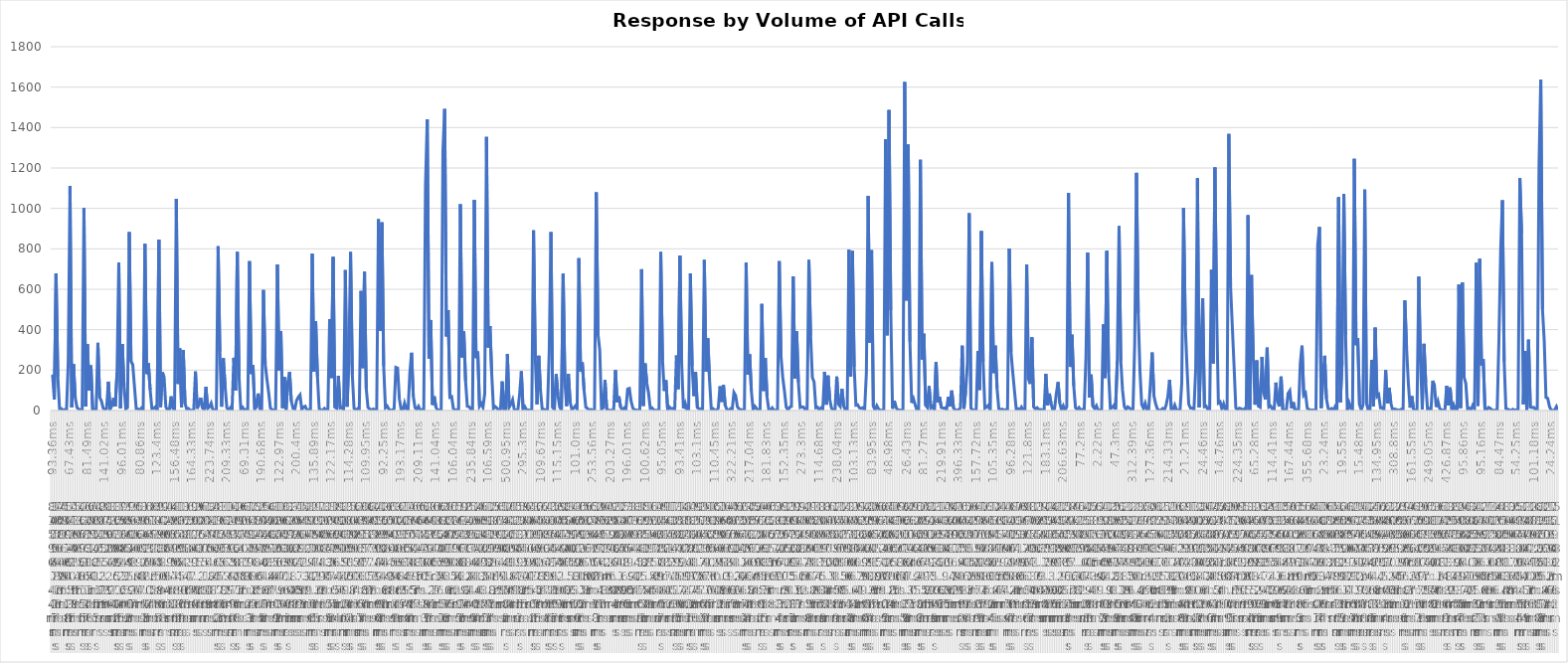
| Category | Number of Calls |
|---|---|
| 0 | 178 |
| 1 | 54 |
| 2 | 678 |
| 3 | 168 |
| 4 | 9 |
| 5 | 10 |
| 6 | 1 |
| 7 | 4 |
| 8 | 1 |
| 9 | 241 |
| 10 | 1112 |
| 11 | 16 |
| 12 | 229 |
| 13 | 65 |
| 14 | 15 |
| 15 | 7 |
| 16 | 2 |
| 17 | 2 |
| 18 | 1002 |
| 19 | 20 |
| 20 | 328 |
| 21 | 99 |
| 22 | 223 |
| 23 | 5 |
| 24 | 6 |
| 25 | 1 |
| 26 | 335 |
| 27 | 66 |
| 28 | 48 |
| 29 | 13 |
| 30 | 4 |
| 31 | 9 |
| 32 | 143 |
| 33 | 7 |
| 34 | 23 |
| 35 | 62 |
| 36 | 20 |
| 37 | 188 |
| 38 | 733 |
| 39 | 10 |
| 40 | 329 |
| 41 | 123 |
| 42 | 8 |
| 43 | 15 |
| 44 | 883 |
| 45 | 243 |
| 46 | 228 |
| 47 | 118 |
| 48 | 9 |
| 49 | 8 |
| 50 | 1 |
| 51 | 12 |
| 52 | 3 |
| 53 | 825 |
| 54 | 181 |
| 55 | 234 |
| 56 | 102 |
| 57 | 9 |
| 58 | 10 |
| 59 | 18 |
| 60 | 1 |
| 61 | 846 |
| 62 | 17 |
| 63 | 189 |
| 64 | 164 |
| 65 | 18 |
| 66 | 2 |
| 67 | 2 |
| 68 | 70 |
| 69 | 12 |
| 70 | 1 |
| 71 | 1047 |
| 72 | 132 |
| 73 | 307 |
| 74 | 16 |
| 75 | 299 |
| 76 | 36 |
| 77 | 6 |
| 78 | 10 |
| 79 | 1 |
| 80 | 1 |
| 81 | 1 |
| 82 | 193 |
| 83 | 9 |
| 84 | 36 |
| 85 | 63 |
| 86 | 13 |
| 87 | 5 |
| 88 | 117 |
| 89 | 10 |
| 90 | 18 |
| 91 | 36 |
| 92 | 3 |
| 93 | 2 |
| 94 | 4 |
| 95 | 813 |
| 96 | 292 |
| 97 | 19 |
| 98 | 258 |
| 99 | 121 |
| 100 | 14 |
| 101 | 2 |
| 102 | 14 |
| 103 | 2 |
| 104 | 261 |
| 105 | 99 |
| 106 | 784 |
| 107 | 167 |
| 108 | 7 |
| 109 | 16 |
| 110 | 1 |
| 111 | 5 |
| 112 | 1 |
| 113 | 739 |
| 114 | 181 |
| 115 | 225 |
| 116 | 6 |
| 117 | 19 |
| 118 | 84 |
| 119 | 8 |
| 120 | 1 |
| 121 | 596 |
| 122 | 231 |
| 123 | 156 |
| 124 | 89 |
| 125 | 12 |
| 126 | 4 |
| 127 | 1 |
| 128 | 6 |
| 129 | 723 |
| 130 | 197 |
| 131 | 393 |
| 132 | 12 |
| 133 | 166 |
| 134 | 3 |
| 135 | 141 |
| 136 | 191 |
| 137 | 46 |
| 138 | 11 |
| 139 | 5 |
| 140 | 49 |
| 141 | 66 |
| 142 | 77 |
| 143 | 4 |
| 144 | 17 |
| 145 | 21 |
| 146 | 1 |
| 147 | 4 |
| 148 | 2 |
| 149 | 776 |
| 150 | 192 |
| 151 | 442 |
| 152 | 170 |
| 153 | 8 |
| 154 | 3 |
| 155 | 1 |
| 156 | 10 |
| 157 | 2 |
| 158 | 6 |
| 159 | 452 |
| 160 | 161 |
| 161 | 760 |
| 162 | 16 |
| 163 | 11 |
| 164 | 172 |
| 165 | 13 |
| 166 | 16 |
| 167 | 2 |
| 168 | 695 |
| 169 | 19 |
| 170 | 249 |
| 171 | 784 |
| 172 | 179 |
| 173 | 11 |
| 174 | 2 |
| 175 | 9 |
| 176 | 1 |
| 177 | 591 |
| 178 | 210 |
| 179 | 686 |
| 180 | 109 |
| 181 | 16 |
| 182 | 7 |
| 183 | 1 |
| 184 | 7 |
| 185 | 3 |
| 186 | 3 |
| 187 | 947 |
| 188 | 394 |
| 189 | 931 |
| 190 | 222 |
| 191 | 14 |
| 192 | 22 |
| 193 | 6 |
| 194 | 1 |
| 195 | 2 |
| 196 | 10 |
| 197 | 213 |
| 198 | 210 |
| 199 | 58 |
| 200 | 5 |
| 201 | 1 |
| 202 | 37 |
| 203 | 8 |
| 204 | 1 |
| 205 | 184 |
| 206 | 286 |
| 207 | 71 |
| 208 | 14 |
| 209 | 6 |
| 210 | 21 |
| 211 | 1 |
| 212 | 4 |
| 213 | 1 |
| 214 | 1110 |
| 215 | 1441 |
| 216 | 257 |
| 217 | 448 |
| 218 | 28 |
| 219 | 70 |
| 220 | 16 |
| 221 | 1 |
| 222 | 2 |
| 223 | 1 |
| 224 | 1282 |
| 225 | 1492 |
| 226 | 367 |
| 227 | 497 |
| 228 | 66 |
| 229 | 69 |
| 230 | 10 |
| 231 | 1 |
| 232 | 3 |
| 233 | 1 |
| 234 | 1020 |
| 235 | 263 |
| 236 | 391 |
| 237 | 147 |
| 238 | 21 |
| 239 | 19 |
| 240 | 7 |
| 241 | 2 |
| 242 | 1042 |
| 243 | 259 |
| 244 | 292 |
| 245 | 21 |
| 246 | 35 |
| 247 | 16 |
| 248 | 84 |
| 249 | 1354 |
| 250 | 312 |
| 251 | 418 |
| 252 | 183 |
| 253 | 10 |
| 254 | 19 |
| 255 | 12 |
| 256 | 1 |
| 257 | 1 |
| 258 | 144 |
| 259 | 6 |
| 260 | 4 |
| 261 | 279 |
| 262 | 16 |
| 263 | 31 |
| 264 | 53 |
| 265 | 1 |
| 266 | 2 |
| 267 | 1 |
| 268 | 80 |
| 269 | 194 |
| 270 | 6 |
| 271 | 19 |
| 272 | 3 |
| 273 | 2 |
| 274 | 1 |
| 275 | 2 |
| 276 | 891 |
| 277 | 258 |
| 278 | 30 |
| 279 | 271 |
| 280 | 99 |
| 281 | 4 |
| 282 | 6 |
| 283 | 1 |
| 284 | 4 |
| 285 | 291 |
| 286 | 883 |
| 287 | 14 |
| 288 | 6 |
| 289 | 180 |
| 290 | 76 |
| 291 | 17 |
| 292 | 1 |
| 293 | 676 |
| 294 | 141 |
| 295 | 22 |
| 296 | 181 |
| 297 | 43 |
| 298 | 5 |
| 299 | 11 |
| 300 | 22 |
| 301 | 7 |
| 302 | 754 |
| 303 | 193 |
| 304 | 238 |
| 305 | 100 |
| 306 | 16 |
| 307 | 10 |
| 308 | 1 |
| 309 | 5 |
| 310 | 1 |
| 311 | 1 |
| 312 | 1079 |
| 313 | 377 |
| 314 | 300 |
| 315 | 6 |
| 316 | 14 |
| 317 | 151 |
| 318 | 6 |
| 319 | 1 |
| 320 | 1 |
| 321 | 1 |
| 322 | 2 |
| 323 | 200 |
| 324 | 41 |
| 325 | 70 |
| 326 | 16 |
| 327 | 3 |
| 328 | 12 |
| 329 | 2 |
| 330 | 106 |
| 331 | 109 |
| 332 | 46 |
| 333 | 12 |
| 334 | 3 |
| 335 | 2 |
| 336 | 1 |
| 337 | 3 |
| 338 | 699 |
| 339 | 23 |
| 340 | 233 |
| 341 | 137 |
| 342 | 87 |
| 343 | 10 |
| 344 | 13 |
| 345 | 2 |
| 346 | 1 |
| 347 | 1 |
| 348 | 2 |
| 349 | 784 |
| 350 | 255 |
| 351 | 97 |
| 352 | 150 |
| 353 | 1 |
| 354 | 17 |
| 355 | 9 |
| 356 | 11 |
| 357 | 2 |
| 358 | 272 |
| 359 | 106 |
| 360 | 766 |
| 361 | 237 |
| 362 | 10 |
| 363 | 36 |
| 364 | 6 |
| 365 | 7 |
| 366 | 679 |
| 367 | 221 |
| 368 | 72 |
| 369 | 191 |
| 370 | 15 |
| 371 | 8 |
| 372 | 8 |
| 373 | 3 |
| 374 | 745 |
| 375 | 192 |
| 376 | 357 |
| 377 | 153 |
| 378 | 4 |
| 379 | 9 |
| 380 | 2 |
| 381 | 1 |
| 382 | 11 |
| 383 | 120 |
| 384 | 43 |
| 385 | 126 |
| 386 | 25 |
| 387 | 4 |
| 388 | 1 |
| 389 | 9 |
| 390 | 4 |
| 391 | 89 |
| 392 | 74 |
| 393 | 18 |
| 394 | 8 |
| 395 | 5 |
| 396 | 1 |
| 397 | 5 |
| 398 | 732 |
| 399 | 177 |
| 400 | 278 |
| 401 | 98 |
| 402 | 4 |
| 403 | 21 |
| 404 | 10 |
| 405 | 1 |
| 406 | 1 |
| 407 | 527 |
| 408 | 97 |
| 409 | 260 |
| 410 | 68 |
| 411 | 4 |
| 412 | 1 |
| 413 | 13 |
| 414 | 1 |
| 415 | 1 |
| 416 | 1 |
| 417 | 739 |
| 418 | 270 |
| 419 | 166 |
| 420 | 95 |
| 421 | 17 |
| 422 | 2 |
| 423 | 16 |
| 424 | 20 |
| 425 | 664 |
| 426 | 159 |
| 427 | 391 |
| 428 | 139 |
| 429 | 15 |
| 430 | 18 |
| 431 | 17 |
| 432 | 2 |
| 433 | 1 |
| 434 | 745 |
| 435 | 371 |
| 436 | 164 |
| 437 | 141 |
| 438 | 14 |
| 439 | 16 |
| 440 | 2 |
| 441 | 13 |
| 442 | 7 |
| 443 | 192 |
| 444 | 29 |
| 445 | 173 |
| 446 | 54 |
| 447 | 12 |
| 448 | 1 |
| 449 | 1 |
| 450 | 168 |
| 451 | 31 |
| 452 | 20 |
| 453 | 108 |
| 454 | 22 |
| 455 | 2 |
| 456 | 2 |
| 457 | 796 |
| 458 | 167 |
| 459 | 789 |
| 460 | 216 |
| 461 | 26 |
| 462 | 28 |
| 463 | 13 |
| 464 | 10 |
| 465 | 14 |
| 466 | 2 |
| 467 | 186 |
| 468 | 1062 |
| 469 | 334 |
| 470 | 793 |
| 471 | 21 |
| 472 | 3 |
| 473 | 24 |
| 474 | 8 |
| 475 | 1 |
| 476 | 1 |
| 477 | 1 |
| 478 | 1342 |
| 479 | 372 |
| 480 | 1487 |
| 481 | 497 |
| 482 | 9 |
| 483 | 48 |
| 484 | 16 |
| 485 | 2 |
| 486 | 2 |
| 487 | 1 |
| 488 | 1 |
| 489 | 1625 |
| 490 | 545 |
| 491 | 1316 |
| 492 | 341 |
| 493 | 38 |
| 494 | 59 |
| 495 | 29 |
| 496 | 1 |
| 497 | 2 |
| 498 | 1241 |
| 499 | 252 |
| 500 | 380 |
| 501 | 26 |
| 502 | 15 |
| 503 | 121 |
| 504 | 13 |
| 505 | 21 |
| 506 | 1 |
| 507 | 239 |
| 508 | 40 |
| 509 | 68 |
| 510 | 15 |
| 511 | 12 |
| 512 | 13 |
| 513 | 2 |
| 514 | 67 |
| 515 | 20 |
| 516 | 99 |
| 517 | 13 |
| 518 | 1 |
| 519 | 3 |
| 520 | 2 |
| 521 | 14 |
| 522 | 321 |
| 523 | 9 |
| 524 | 98 |
| 525 | 235 |
| 526 | 976 |
| 527 | 12 |
| 528 | 3 |
| 529 | 1 |
| 530 | 1 |
| 531 | 295 |
| 532 | 102 |
| 533 | 888 |
| 534 | 241 |
| 535 | 12 |
| 536 | 17 |
| 537 | 26 |
| 538 | 1 |
| 539 | 734 |
| 540 | 186 |
| 541 | 321 |
| 542 | 110 |
| 543 | 9 |
| 544 | 4 |
| 545 | 7 |
| 546 | 1 |
| 547 | 4 |
| 548 | 1 |
| 549 | 802 |
| 550 | 290 |
| 551 | 189 |
| 552 | 97 |
| 553 | 7 |
| 554 | 9 |
| 555 | 1 |
| 556 | 17 |
| 557 | 1 |
| 558 | 1 |
| 559 | 723 |
| 560 | 156 |
| 561 | 132 |
| 562 | 362 |
| 563 | 18 |
| 564 | 8 |
| 565 | 14 |
| 566 | 4 |
| 567 | 5 |
| 568 | 3 |
| 569 | 1 |
| 570 | 182 |
| 571 | 25 |
| 572 | 84 |
| 573 | 35 |
| 574 | 1 |
| 575 | 9 |
| 576 | 83 |
| 577 | 141 |
| 578 | 37 |
| 579 | 1 |
| 580 | 23 |
| 581 | 2 |
| 582 | 18 |
| 583 | 1077 |
| 584 | 216 |
| 585 | 375 |
| 586 | 122 |
| 587 | 14 |
| 588 | 4 |
| 589 | 15 |
| 590 | 2 |
| 591 | 5 |
| 592 | 1 |
| 593 | 260 |
| 594 | 782 |
| 595 | 64 |
| 596 | 178 |
| 597 | 20 |
| 598 | 10 |
| 599 | 24 |
| 600 | 1 |
| 601 | 1 |
| 602 | 6 |
| 603 | 426 |
| 604 | 161 |
| 605 | 790 |
| 606 | 190 |
| 607 | 11 |
| 608 | 14 |
| 609 | 25 |
| 610 | 5 |
| 611 | 246 |
| 612 | 912 |
| 613 | 246 |
| 614 | 101 |
| 615 | 21 |
| 616 | 4 |
| 617 | 18 |
| 618 | 13 |
| 619 | 2 |
| 620 | 1 |
| 621 | 335 |
| 622 | 1176 |
| 623 | 483 |
| 624 | 196 |
| 625 | 30 |
| 626 | 11 |
| 627 | 36 |
| 628 | 1 |
| 629 | 2 |
| 630 | 132 |
| 631 | 287 |
| 632 | 74 |
| 633 | 33 |
| 634 | 8 |
| 635 | 1 |
| 636 | 2 |
| 637 | 10 |
| 638 | 2 |
| 639 | 26 |
| 640 | 69 |
| 641 | 152 |
| 642 | 6 |
| 643 | 2 |
| 644 | 26 |
| 645 | 2 |
| 646 | 1 |
| 647 | 1 |
| 648 | 139 |
| 649 | 1002 |
| 650 | 422 |
| 651 | 215 |
| 652 | 31 |
| 653 | 12 |
| 654 | 12 |
| 655 | 3 |
| 656 | 208 |
| 657 | 1150 |
| 658 | 16 |
| 659 | 302 |
| 660 | 556 |
| 661 | 19 |
| 662 | 22 |
| 663 | 3 |
| 664 | 1 |
| 665 | 696 |
| 666 | 233 |
| 667 | 1202 |
| 668 | 490 |
| 669 | 37 |
| 670 | 43 |
| 671 | 9 |
| 672 | 33 |
| 673 | 4 |
| 674 | 1 |
| 675 | 1368 |
| 676 | 613 |
| 677 | 416 |
| 678 | 220 |
| 679 | 14 |
| 680 | 1 |
| 681 | 11 |
| 682 | 9 |
| 683 | 1 |
| 684 | 9 |
| 685 | 3 |
| 686 | 966 |
| 687 | 2 |
| 688 | 670 |
| 689 | 267 |
| 690 | 29 |
| 691 | 248 |
| 692 | 21 |
| 693 | 16 |
| 694 | 265 |
| 695 | 88 |
| 696 | 55 |
| 697 | 311 |
| 698 | 17 |
| 699 | 22 |
| 700 | 8 |
| 701 | 2 |
| 702 | 138 |
| 703 | 46 |
| 704 | 20 |
| 705 | 168 |
| 706 | 2 |
| 707 | 1 |
| 708 | 3 |
| 709 | 85 |
| 710 | 98 |
| 711 | 11 |
| 712 | 41 |
| 713 | 1 |
| 714 | 2 |
| 715 | 1 |
| 716 | 233 |
| 717 | 321 |
| 718 | 76 |
| 719 | 86 |
| 720 | 11 |
| 721 | 5 |
| 722 | 1 |
| 723 | 2 |
| 724 | 1 |
| 725 | 1 |
| 726 | 818 |
| 727 | 908 |
| 728 | 12 |
| 729 | 162 |
| 730 | 271 |
| 731 | 59 |
| 732 | 11 |
| 733 | 1 |
| 734 | 10 |
| 735 | 1 |
| 736 | 19 |
| 737 | 3 |
| 738 | 1055 |
| 739 | 41 |
| 740 | 242 |
| 741 | 1071 |
| 742 | 372 |
| 743 | 1 |
| 744 | 38 |
| 745 | 11 |
| 746 | 6 |
| 747 | 1246 |
| 748 | 323 |
| 749 | 359 |
| 750 | 30 |
| 751 | 2 |
| 752 | 28 |
| 753 | 1093 |
| 754 | 37 |
| 755 | 1 |
| 756 | 2 |
| 757 | 251 |
| 758 | 20 |
| 759 | 410 |
| 760 | 69 |
| 761 | 78 |
| 762 | 14 |
| 763 | 15 |
| 764 | 1 |
| 765 | 200 |
| 766 | 36 |
| 767 | 113 |
| 768 | 37 |
| 769 | 1 |
| 770 | 8 |
| 771 | 5 |
| 772 | 2 |
| 773 | 2 |
| 774 | 6 |
| 775 | 1 |
| 776 | 545 |
| 777 | 308 |
| 778 | 139 |
| 779 | 14 |
| 780 | 71 |
| 781 | 6 |
| 782 | 1 |
| 783 | 1 |
| 784 | 663 |
| 785 | 236 |
| 786 | 6 |
| 787 | 330 |
| 788 | 138 |
| 789 | 6 |
| 790 | 10 |
| 791 | 1 |
| 792 | 147 |
| 793 | 123 |
| 794 | 18 |
| 795 | 46 |
| 796 | 10 |
| 797 | 3 |
| 798 | 1 |
| 799 | 1 |
| 800 | 122 |
| 801 | 26 |
| 802 | 114 |
| 803 | 3 |
| 804 | 29 |
| 805 | 4 |
| 806 | 7 |
| 807 | 623 |
| 808 | 12 |
| 809 | 634 |
| 810 | 165 |
| 811 | 134 |
| 812 | 7 |
| 813 | 12 |
| 814 | 2 |
| 815 | 26 |
| 816 | 11 |
| 817 | 731 |
| 818 | 23 |
| 819 | 750 |
| 820 | 224 |
| 821 | 254 |
| 822 | 3 |
| 823 | 3 |
| 824 | 15 |
| 825 | 11 |
| 826 | 2 |
| 827 | 1 |
| 828 | 1 |
| 829 | 2 |
| 830 | 351 |
| 831 | 795 |
| 832 | 1040 |
| 833 | 243 |
| 834 | 10 |
| 835 | 7 |
| 836 | 3 |
| 837 | 1 |
| 838 | 6 |
| 839 | 1 |
| 840 | 3 |
| 841 | 1 |
| 842 | 1151 |
| 843 | 877 |
| 844 | 31 |
| 845 | 294 |
| 846 | 2 |
| 847 | 350 |
| 848 | 17 |
| 849 | 15 |
| 850 | 16 |
| 851 | 5 |
| 852 | 4 |
| 853 | 1212 |
| 854 | 1637 |
| 855 | 500 |
| 856 | 344 |
| 857 | 65 |
| 858 | 60 |
| 859 | 20 |
| 860 | 2 |
| 861 | 1 |
| 862 | 3 |
| 863 | 20 |
| 864 | 1 |